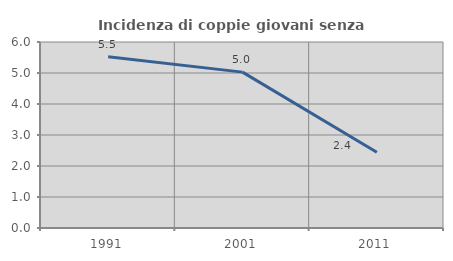
| Category | Incidenza di coppie giovani senza figli |
|---|---|
| 1991.0 | 5.526 |
| 2001.0 | 5.029 |
| 2011.0 | 2.445 |